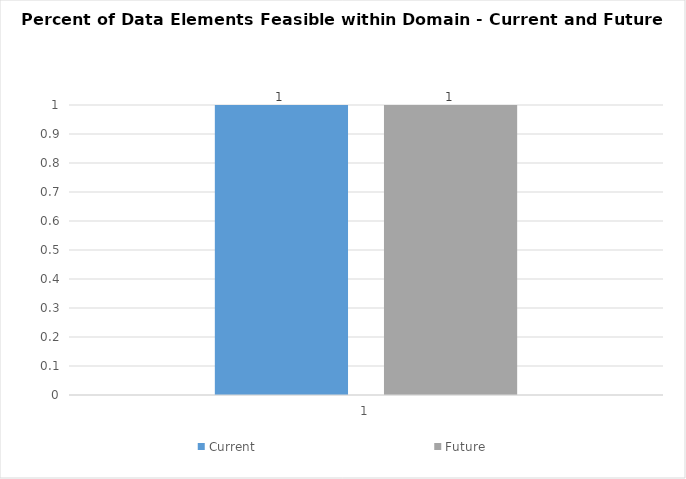
| Category | Current | Future |
|---|---|---|
| 0 | 1 | 1 |